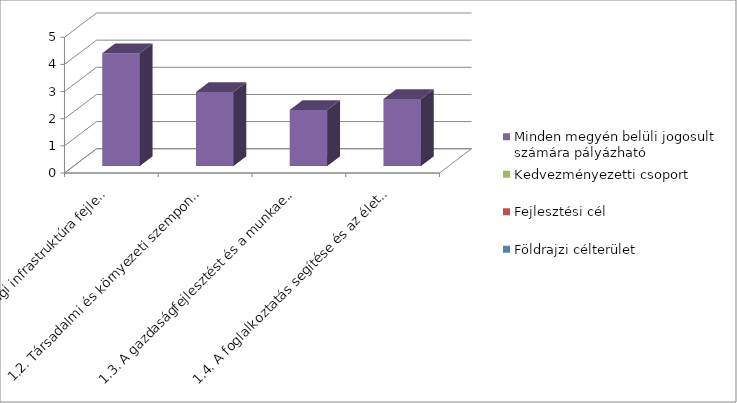
| Category | Földrajzi célterület  | Fejlesztési cél  | Kedvezményezetti csoport | Minden megyén belüli jogosult számára pályázható   |
|---|---|---|---|---|
| 1.1. Helyi gazdasági infrastruktúra fejlesztése | 0 | 0 | 0 | 4.147 |
| 1.2. Társadalmi és környezeti szempontból fenntartható turizmusfejlesztés | 0 | 0 | 0 | 2.718 |
| 1.3. A gazdaságfejlesztést és a munkaerő mobilitás ösztönzését szolgáló közlekedésfejlesztés | 0 | 0 | 0 | 2.055 |
| 1.4. A foglalkoztatás segítése és az életminőség javítása családbarát, munkába állást segítő intézmények, közszolgáltatások fejlesztésével | 0 | 0 | 0 | 2.458 |